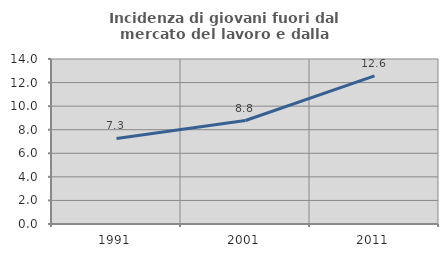
| Category | Incidenza di giovani fuori dal mercato del lavoro e dalla formazione  |
|---|---|
| 1991.0 | 7.258 |
| 2001.0 | 8.78 |
| 2011.0 | 12.575 |